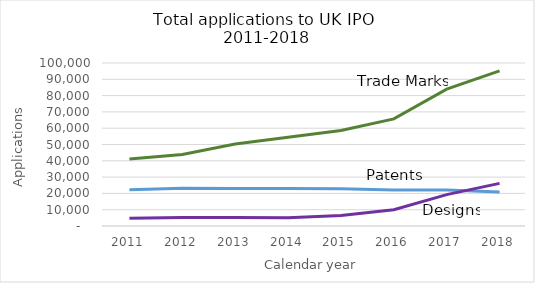
| Category | Patents1 | Trade marks2 | Designs |
|---|---|---|---|
| 2011.0 | 22256 | 41044 | 4730 |
| 2012.0 | 23229 | 43873 | 5231 |
| 2013.0 | 22936 | 50331 | 5210 |
| 2014.0 | 23040 | 54498 | 5084 |
| 2015.0 | 22801 | 58627 | 6472 |
| 2016.0 | 22055 | 65710 | 10030 |
| 2017.0 | 22072 | 83984 | 19269 |
| 2018.0 | 20931 | 95203 | 26164 |